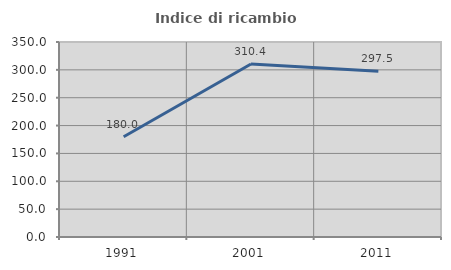
| Category | Indice di ricambio occupazionale  |
|---|---|
| 1991.0 | 180 |
| 2001.0 | 310.417 |
| 2011.0 | 297.5 |